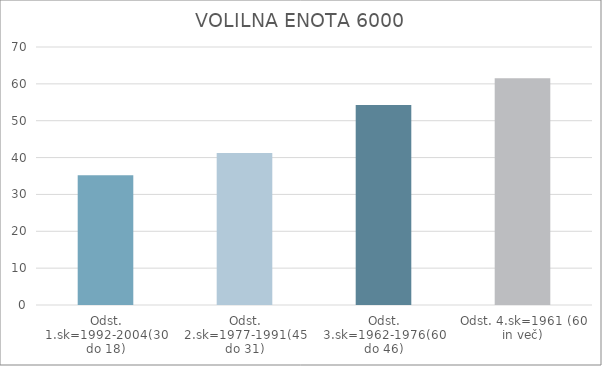
| Category | Series 0 |
|---|---|
| Odst. 1.sk=1992-2004(30 do 18) | 35.22 |
| Odst. 2.sk=1977-1991(45 do 31) | 41.21 |
| Odst. 3.sk=1962-1976(60 do 46) | 54.25 |
| Odst. 4.sk=1961 (60 in več) | 61.54 |